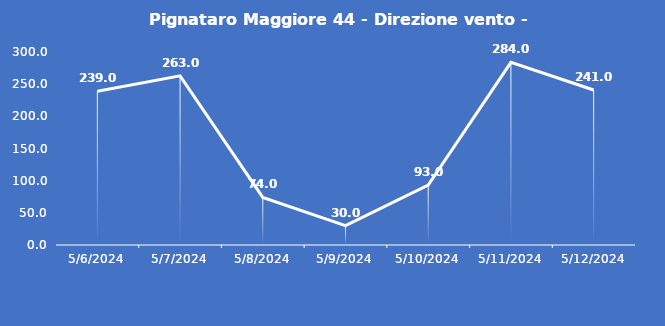
| Category | Pignataro Maggiore 44 - Direzione vento - Grezzo (°N) |
|---|---|
| 5/6/24 | 239 |
| 5/7/24 | 263 |
| 5/8/24 | 74 |
| 5/9/24 | 30 |
| 5/10/24 | 93 |
| 5/11/24 | 284 |
| 5/12/24 | 241 |